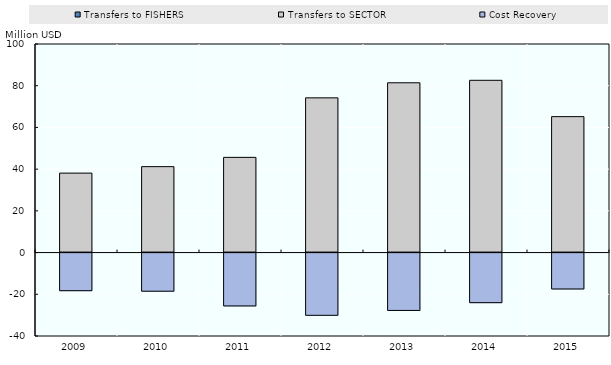
| Category | Transfers to FISHERS | Transfers to SECTOR | Cost Recovery |
|---|---|---|---|
| 2009.0 |  | 38.094 | -18.509 |
| 2010.0 |  | 41.195 | -18.767 |
| 2011.0 |  | 45.645 | -25.819 |
| 2012.0 |  | 74.182 | -30.328 |
| 2013.0 |  | 81.41 | -27.985 |
| 2014.0 |  | 82.594 | -24.256 |
| 2015.0 |  | 65.179 | -17.696 |